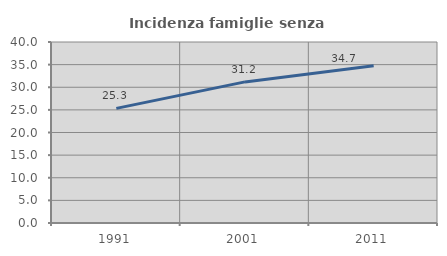
| Category | Incidenza famiglie senza nuclei |
|---|---|
| 1991.0 | 25.325 |
| 2001.0 | 31.185 |
| 2011.0 | 34.739 |